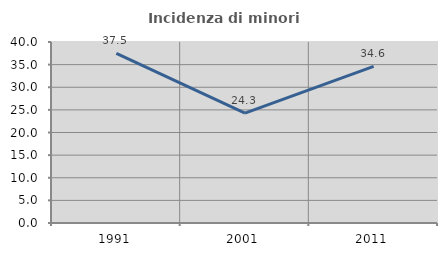
| Category | Incidenza di minori stranieri |
|---|---|
| 1991.0 | 37.5 |
| 2001.0 | 24.286 |
| 2011.0 | 34.615 |